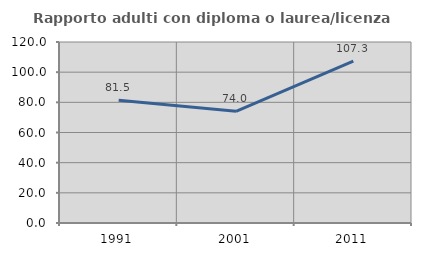
| Category | Rapporto adulti con diploma o laurea/licenza media  |
|---|---|
| 1991.0 | 81.452 |
| 2001.0 | 74.026 |
| 2011.0 | 107.317 |